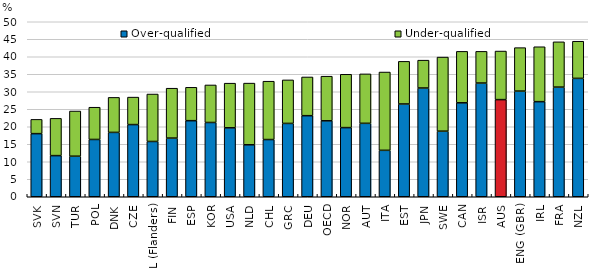
| Category | Over-qualified | Under-qualified |
|---|---|---|
| SVK | 18.034 | 4.075 |
| SVN | 11.752 | 10.647 |
| TUR | 11.587 | 12.91 |
| POL | 16.37 | 9.213 |
| DNK | 18.386 | 10.005 |
| CZE | 20.623 | 7.849 |
| BEL (Flanders) | 15.798 | 13.55 |
| FIN | 16.762 | 14.254 |
| ESP | 21.741 | 9.535 |
| KOR | 21.221 | 10.724 |
| USA | 19.697 | 12.754 |
| NLD | 14.848 | 17.621 |
| CHL | 16.345 | 16.673 |
| GRC | 20.954 | 12.432 |
| DEU | 23.165 | 11.058 |
| OECD | 21.698 | 12.749 |
| NOR | 19.756 | 15.237 |
| AUT | 20.979 | 14.123 |
| ITA | 13.265 | 22.371 |
| EST | 26.507 | 12.181 |
| JPN | 31.069 | 7.958 |
| SWE | 18.741 | 21.167 |
| CAN | 26.841 | 14.701 |
| ISR | 32.489 | 9.055 |
| AUS | 27.752 | 13.879 |
| ENG (GBR) | 30.188 | 12.417 |
| IRL | 27.172 | 15.687 |
| FRA | 31.33 | 12.936 |
| NZL | 33.823 | 10.613 |